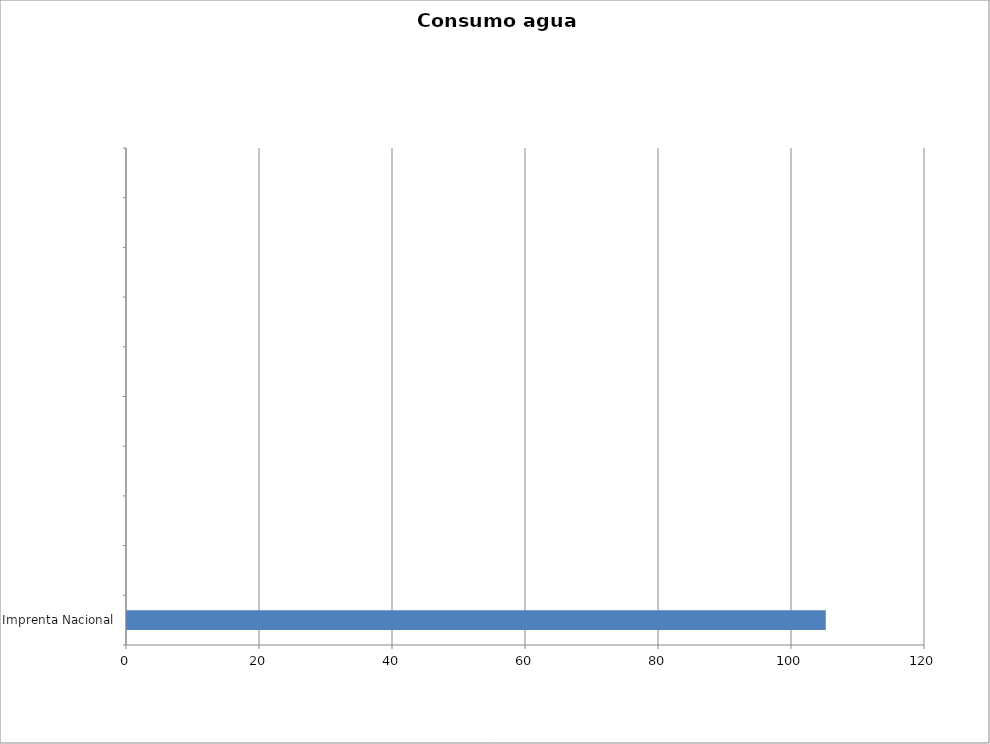
| Category | Series 0 |
|---|---|
| Imprenta Nacional | 105.083 |